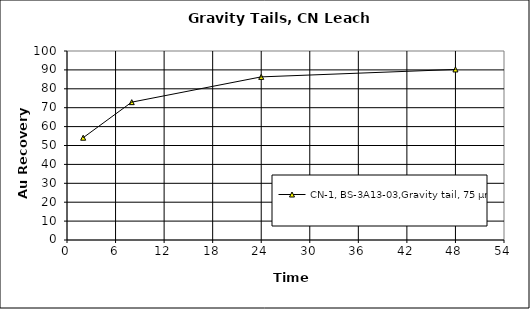
| Category | CN-1, BS-3A13-03,Gravity tail, 75 µm |
|---|---|
| 2.0 | 54.124 |
| 8.0 | 72.936 |
| 24.0 | 86.304 |
| 48.0 | 90.234 |